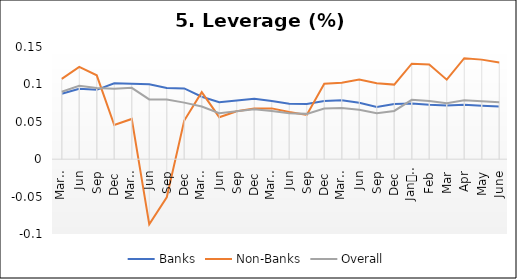
| Category | Banks | Non-Banks | Overall |
|---|---|---|---|
| 0 | 0.088 | 0.107 | 0.09 |
| 1 | 0.094 | 0.123 | 0.098 |
| 2 | 0.093 | 0.112 | 0.095 |
| 3 | 0.102 | 0.046 | 0.094 |
| 4 | 0.101 | 0.054 | 0.095 |
| 5 | 0.1 | -0.087 | 0.08 |
| 6 | 0.095 | -0.051 | 0.08 |
| 7 | 0.095 | 0.052 | 0.076 |
| 8 | 0.084 | 0.09 | 0.07 |
| 9 | 0.076 | 0.056 | 0.062 |
| 10 | 0.079 | 0.064 | 0.064 |
| 11 | 0.081 | 0.068 | 0.067 |
| 12 | 0.078 | 0.068 | 0.064 |
| 13 | 0.074 | 0.063 | 0.061 |
| 14 | 0.074 | 0.059 | 0.061 |
| 15 | 0.078 | 0.101 | 0.068 |
| 16 | 0.079 | 0.102 | 0.068 |
| 17 | 0.075 | 0.106 | 0.066 |
| 18 | 0.07 | 0.102 | 0.061 |
| 19 | 0.074 | 0.1 | 0.064 |
| 20 | 0.074 | 0.128 | 0.079 |
| 21 | 0.073 | 0.126 | 0.078 |
| 22 | 0.072 | 0.106 | 0.075 |
| 23 | 0.073 | 0.135 | 0.079 |
| 24 | 0.072 | 0.133 | 0.077 |
| 25 | 0.071 | 0.129 | 0.076 |